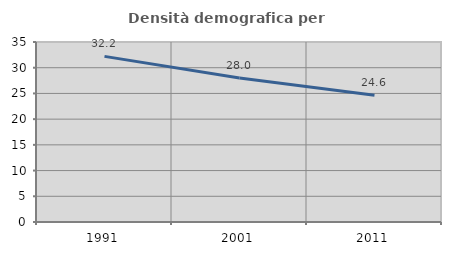
| Category | Densità demografica |
|---|---|
| 1991.0 | 32.205 |
| 2001.0 | 27.998 |
| 2011.0 | 24.637 |